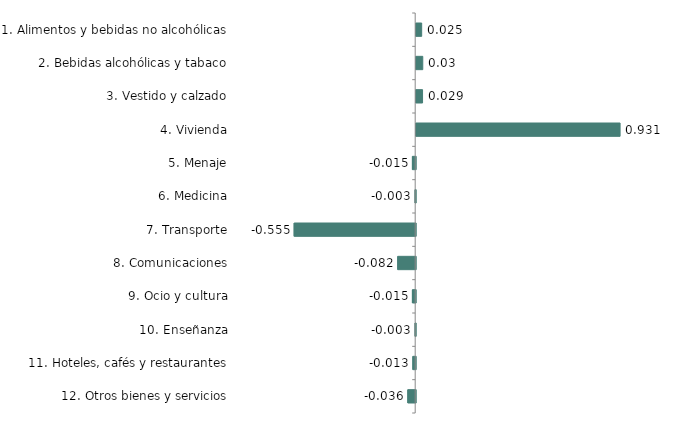
| Category | Series 0 |
|---|---|
| 1. Alimentos y bebidas no alcohólicas | 0.025 |
| 2. Bebidas alcohólicas y tabaco | 0.03 |
| 3. Vestido y calzado | 0.029 |
| 4. Vivienda | 0.931 |
| 5. Menaje | -0.015 |
| 6. Medicina | -0.003 |
| 7. Transporte | -0.555 |
| 8. Comunicaciones | -0.082 |
| 9. Ocio y cultura | -0.015 |
| 10. Enseñanza | -0.003 |
| 11. Hoteles, cafés y restaurantes | -0.013 |
| 12. Otros bienes y servicios | -0.036 |